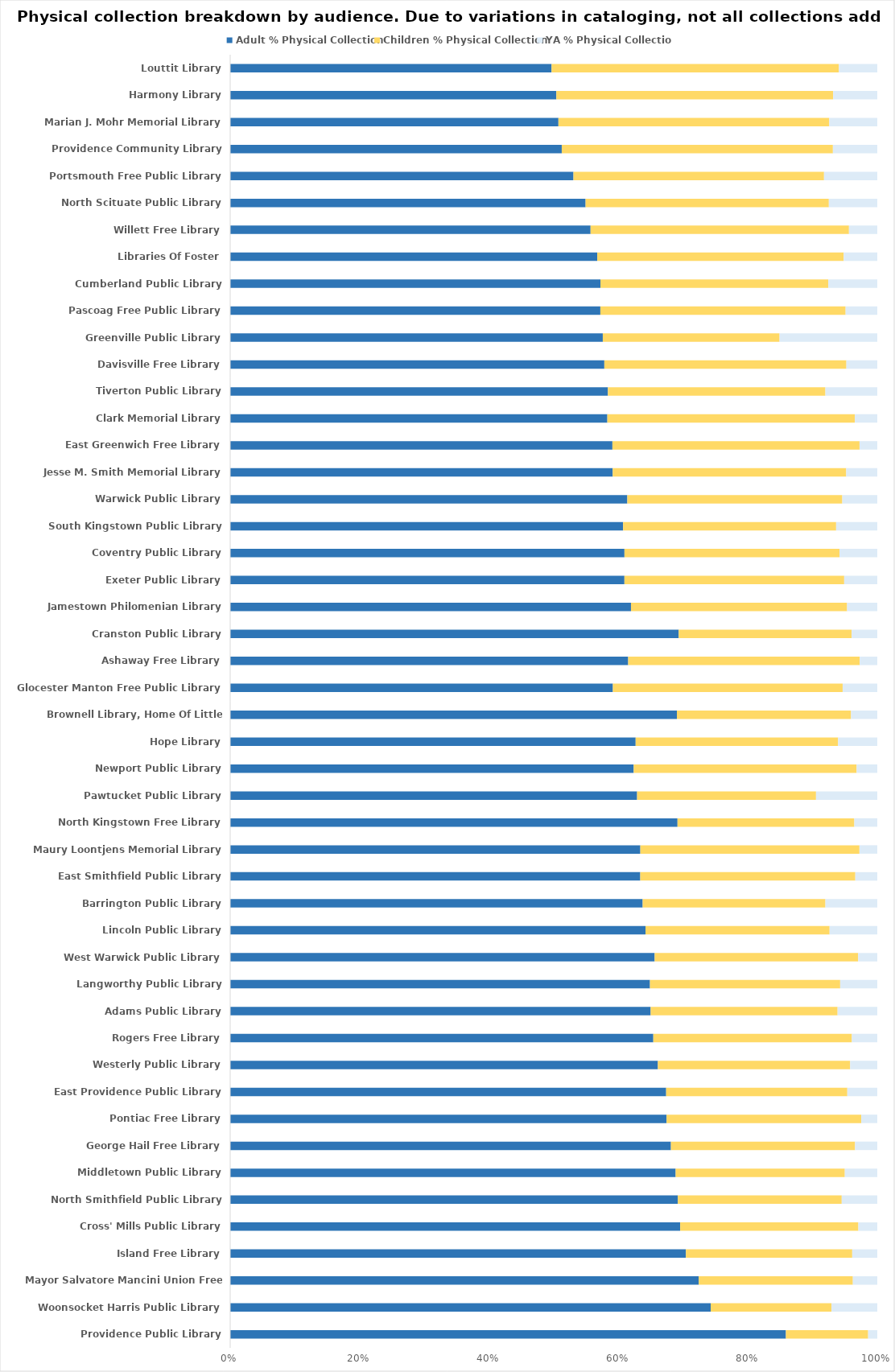
| Category | Adult % Physical Collection | Children % Physical Collection | YA % Physical Collection |
|---|---|---|---|
| Providence Public Library | 0.859 | 0.127 | 0.014 |
| Woonsocket Harris Public Library | 0.742 | 0.187 | 0.071 |
| Mayor Salvatore Mancini Union Free Library | 0.724 | 0.238 | 0.038 |
| Island Free Library | 0.704 | 0.257 | 0.039 |
| Cross' Mills Public Library | 0.695 | 0.275 | 0.029 |
| North Smithfield Public Library | 0.691 | 0.253 | 0.055 |
| Middletown Public Library | 0.688 | 0.261 | 0.05 |
| George Hail Free Library | 0.681 | 0.284 | 0.034 |
| Pontiac Free Library | 0.674 | 0.301 | 0.025 |
| East Providence Public Library | 0.673 | 0.28 | 0.046 |
| Westerly Public Library | 0.661 | 0.297 | 0.042 |
| Rogers Free Library | 0.654 | 0.307 | 0.039 |
| Adams Public Library | 0.649 | 0.289 | 0.061 |
| Langworthy Public Library | 0.648 | 0.294 | 0.057 |
| West Warwick Public Library | 0.645 | 0.309 | 0.029 |
| Lincoln Public Library | 0.642 | 0.284 | 0.074 |
| Barrington Public Library | 0.637 | 0.282 | 0.08 |
| East Smithfield Public Library | 0.634 | 0.332 | 0.034 |
| Maury Loontjens Memorial Library | 0.634 | 0.338 | 0.028 |
| North Kingstown Free Library | 0.631 | 0.249 | 0.032 |
| Pawtucket Public Library | 0.629 | 0.277 | 0.095 |
| Newport Public Library | 0.623 | 0.344 | 0.032 |
| Hope Library | 0.623 | 0.311 | 0.06 |
| Brownell Library, Home Of Little Compton | 0.619 | 0.241 | 0.036 |
| Glocester Manton Free Public Library | 0.615 | 0.369 | 0.056 |
| Ashaway Free Library | 0.615 | 0.358 | 0.027 |
| Cranston Public Library | 0.614 | 0.237 | 0.035 |
| Jamestown Philomenian Library | 0.614 | 0.331 | 0.046 |
| Exeter Public Library | 0.609 | 0.339 | 0.051 |
| Coventry Public Library | 0.609 | 0.332 | 0.058 |
| South Kingstown Public Library | 0.607 | 0.329 | 0.064 |
| Warwick Public Library | 0.605 | 0.327 | 0.053 |
| Jesse M. Smith Memorial Library | 0.591 | 0.361 | 0.048 |
| East Greenwich Free Library | 0.59 | 0.381 | 0.027 |
| Clark Memorial Library | 0.582 | 0.382 | 0.035 |
| Tiverton Public Library | 0.582 | 0.335 | 0.08 |
| Davisville Free Library | 0.578 | 0.374 | 0.048 |
| Greenville Public Library | 0.576 | 0.273 | 0.151 |
| Pascoag Free Public Library | 0.573 | 0.38 | 0.049 |
| Cumberland Public Library | 0.568 | 0.349 | 0.075 |
| Libraries Of Foster | 0.567 | 0.381 | 0.052 |
| Willett Free Library | 0.557 | 0.399 | 0.044 |
| North Scituate Public Library | 0.549 | 0.376 | 0.075 |
| Portsmouth Free Public Library | 0.53 | 0.387 | 0.082 |
| Providence Community Library | 0.512 | 0.419 | 0.069 |
| Marian J. Mohr Memorial Library | 0.507 | 0.419 | 0.074 |
| Harmony Library | 0.504 | 0.428 | 0.068 |
| Louttit Library | 0.497 | 0.444 | 0.059 |